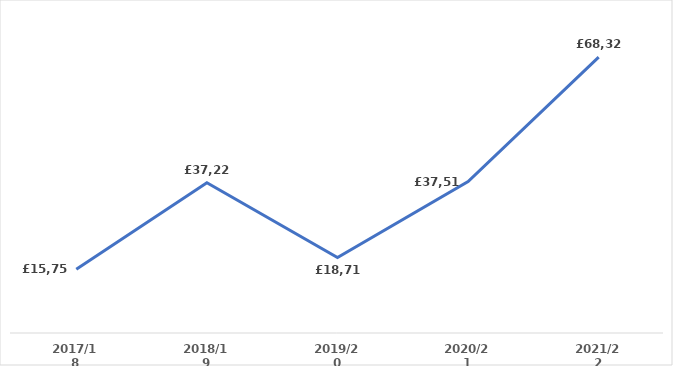
| Category | Series 0 |
|---|---|
| 2017/18 | 15758.83 |
| 2018/19 | 37222.3 |
| 2019/20 | 18714.97 |
| 2020/21 | 37513.3 |
| 2021/22 | 68322.68 |